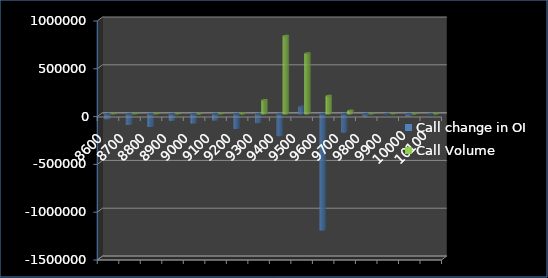
| Category | Call change in OI | Call Volume |
|---|---|---|
| 8600.0 | -51975 | 915 |
| 8700.0 | -111750 | 2119 |
| 8800.0 | -131175 | 2523 |
| 8900.0 | -66975 | 1316 |
| 9000.0 | -96375 | 3687 |
| 9100.0 | -65100 | 1752 |
| 9200.0 | -152325 | 8067 |
| 9300.0 | -91500 | 144472 |
| 9400.0 | -227850 | 816526 |
| 9500.0 | 78075 | 633479 |
| 9600.0 | -1215225 | 188857 |
| 9700.0 | -192000 | 34075 |
| 9800.0 | -29400 | 3728 |
| 9900.0 | 900 | 1234 |
| 10000.0 | -25050 | 3094 |
| 10100.0 | 225 | 5366 |